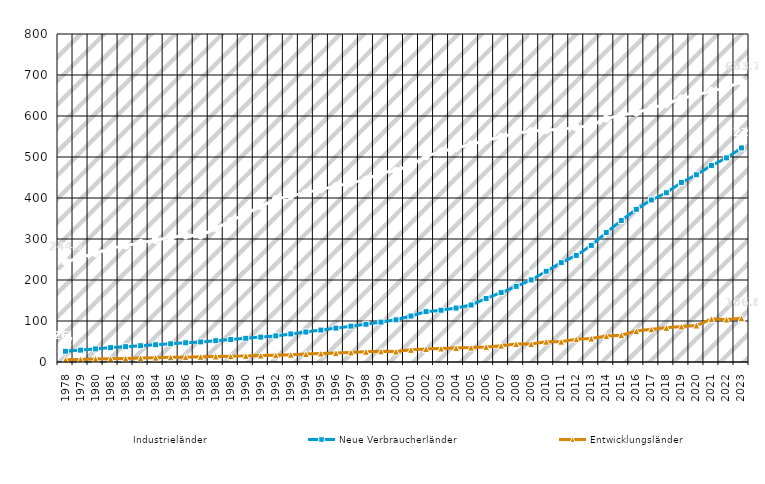
| Category | Industrieländer | Neue Verbraucherländer | Entwicklungsländer |
|---|---|---|---|
| 1978.0 | 244.156 | 26.125 | 5.363 |
| 1979.0 | 254.753 | 28.987 | 6.33 |
| 1980.0 | 265.35 | 31.849 | 7.298 |
| 1981.0 | 277.222 | 35.086 | 7.842 |
| 1982.0 | 283.891 | 37.417 | 8.74 |
| 1983.0 | 290.56 | 39.748 | 9.637 |
| 1984.0 | 297.23 | 42.078 | 10.534 |
| 1985.0 | 303.899 | 44.409 | 11.432 |
| 1986.0 | 308.259 | 46.849 | 11.888 |
| 1987.0 | 308.374 | 49.038 | 12.651 |
| 1988.0 | 326.139 | 51.963 | 13.413 |
| 1989.0 | 343.904 | 54.889 | 14.176 |
| 1990.0 | 361.668 | 57.814 | 14.939 |
| 1991.0 | 379.433 | 60.74 | 15.701 |
| 1992.0 | 397.198 | 63.665 | 16.464 |
| 1993.0 | 405.141 | 68.412 | 17.864 |
| 1994.0 | 413.084 | 73.158 | 19.265 |
| 1995.0 | 421.027 | 77.904 | 20.666 |
| 1996.0 | 428.97 | 82.651 | 22.066 |
| 1997.0 | 436.913 | 87.398 | 23.466 |
| 1998.0 | 444.856 | 92.144 | 24.867 |
| 1999.0 | 461.769 | 97.36 | 26.045 |
| 2000.0 | 466.547 | 102.896 | 25.622 |
| 2001.0 | 480.118 | 112.149 | 29.675 |
| 2002.0 | 501.475 | 122.848 | 31.801 |
| 2003.0 | 513.612 | 126.272 | 32.932 |
| 2004.0 | 521.923 | 131.527 | 34.214 |
| 2005.0 | 530.838 | 139.024 | 35.115 |
| 2006.0 | 540.789 | 155 | 36.877 |
| 2007.0 | 549.515 | 169.214 | 39.845 |
| 2008.0 | 558.075 | 184.384 | 43.669 |
| 2009.0 | 563.268 | 200.168 | 43.645 |
| 2010.0 | 564.962 | 221.37 | 49.516 |
| 2011.0 | 568.292 | 242.351 | 49.614 |
| 2012.0 | 571.623 | 259.965 | 55.747 |
| 2013.0 | 577.525 | 284.356 | 57.147 |
| 2014.0 | 593.53 | 315.758 | 63.162 |
| 2015.0 | 602.616 | 345.15 | 65.475 |
| 2016.0 | 608.046 | 372.474 | 75.49 |
| 2017.0 | 619.095 | 395.248 | 79.684 |
| 2018.0 | 629.31 | 412.753 | 83.299 |
| 2019.0 | 643.184 | 437.84 | 86.548 |
| 2020.0 | 650.965 | 456.74 | 89.001 |
| 2021.0 | 661.293 | 479.331 | 104.581 |
| 2022.0 | 668.656 | 497.815 | 103.627 |
| 2023.0 | 683.714 | 522.07 | 106.842 |